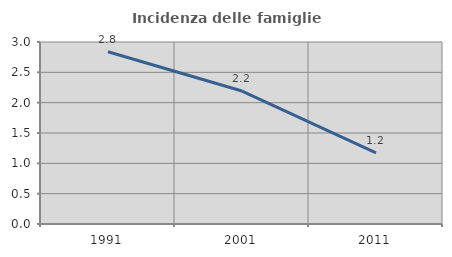
| Category | Incidenza delle famiglie numerose |
|---|---|
| 1991.0 | 2.84 |
| 2001.0 | 2.192 |
| 2011.0 | 1.173 |